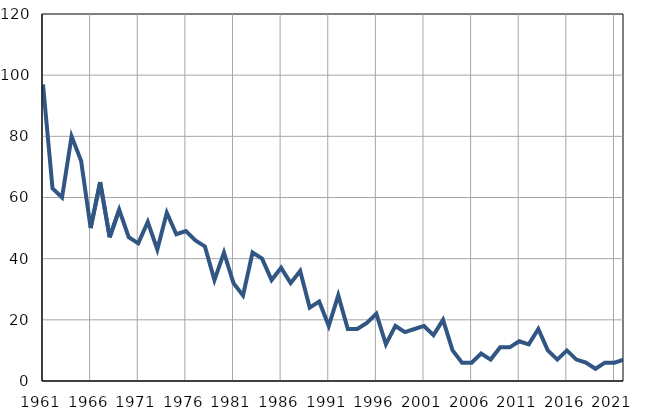
| Category | Infants
deaths |
|---|---|
| 1961.0 | 97 |
| 1962.0 | 63 |
| 1963.0 | 60 |
| 1964.0 | 80 |
| 1965.0 | 72 |
| 1966.0 | 50 |
| 1967.0 | 65 |
| 1968.0 | 47 |
| 1969.0 | 56 |
| 1970.0 | 47 |
| 1971.0 | 45 |
| 1972.0 | 52 |
| 1973.0 | 43 |
| 1974.0 | 55 |
| 1975.0 | 48 |
| 1976.0 | 49 |
| 1977.0 | 46 |
| 1978.0 | 44 |
| 1979.0 | 33 |
| 1980.0 | 42 |
| 1981.0 | 32 |
| 1982.0 | 28 |
| 1983.0 | 42 |
| 1984.0 | 40 |
| 1985.0 | 33 |
| 1986.0 | 37 |
| 1987.0 | 32 |
| 1988.0 | 36 |
| 1989.0 | 24 |
| 1990.0 | 26 |
| 1991.0 | 18 |
| 1992.0 | 28 |
| 1993.0 | 17 |
| 1994.0 | 17 |
| 1995.0 | 19 |
| 1996.0 | 22 |
| 1997.0 | 12 |
| 1998.0 | 18 |
| 1999.0 | 16 |
| 2000.0 | 17 |
| 2001.0 | 18 |
| 2002.0 | 15 |
| 2003.0 | 20 |
| 2004.0 | 10 |
| 2005.0 | 6 |
| 2006.0 | 6 |
| 2007.0 | 9 |
| 2008.0 | 7 |
| 2009.0 | 11 |
| 2010.0 | 11 |
| 2011.0 | 13 |
| 2012.0 | 12 |
| 2013.0 | 17 |
| 2014.0 | 10 |
| 2015.0 | 7 |
| 2016.0 | 10 |
| 2017.0 | 7 |
| 2018.0 | 6 |
| 2019.0 | 4 |
| 2020.0 | 6 |
| 2021.0 | 6 |
| 2022.0 | 7 |